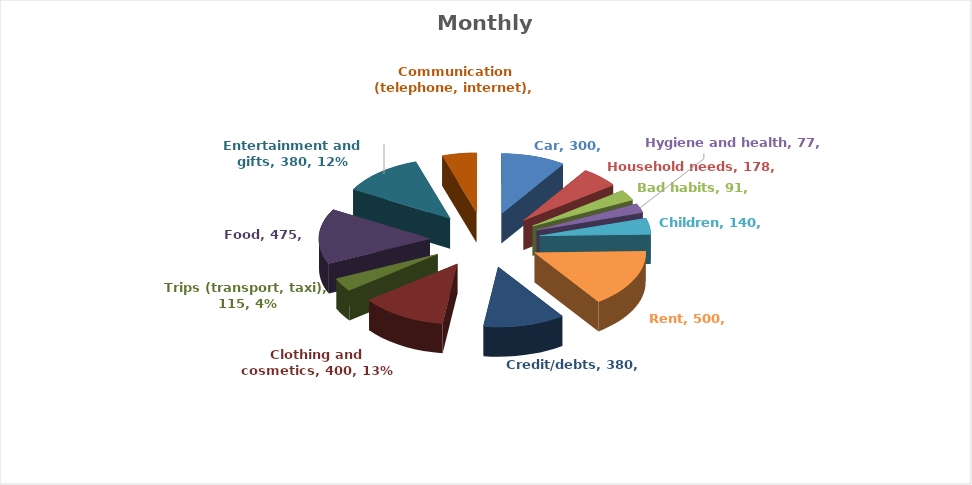
| Category | Series 3 | Series 0 | Series 1 | Series 2 |
|---|---|---|---|---|
| Car | 300 |  |  | 300 |
| Household needs | 178 |  |  | 178 |
| Bad habits | 91 |  |  | 91 |
| Hygiene and health | 77 |  |  | 77 |
| Children | 140 |  |  | 140 |
| Rent | 500 |  |  | 500 |
| Credit/debts | 380 |  |  | 380 |
| Clothing and cosmetics | 400 |  |  | 400 |
| Trips (transport, taxi) | 115 |  |  | 115 |
| Food | 475 |  |  | 475 |
| Entertainment and gifts | 380 |  |  | 380 |
| Communication (telephone, internet) | 160 |  |  | 160 |